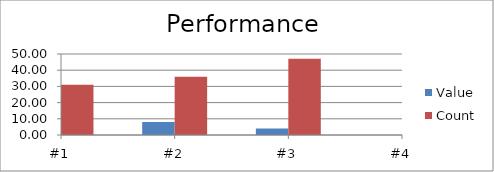
| Category | Value | Count |
|---|---|---|
| #1 | 10 | 31 |
| #2 | 8 | 36 |
| #3 | 4 | 47 |
| #4 | 0 | 44 |